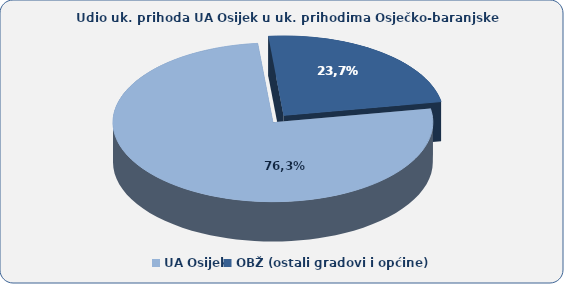
| Category | 76,3 23,7 |
|---|---|
| UA Osijek | 76.255 |
| OBŽ (ostali gradovi i općine) | 23.745 |